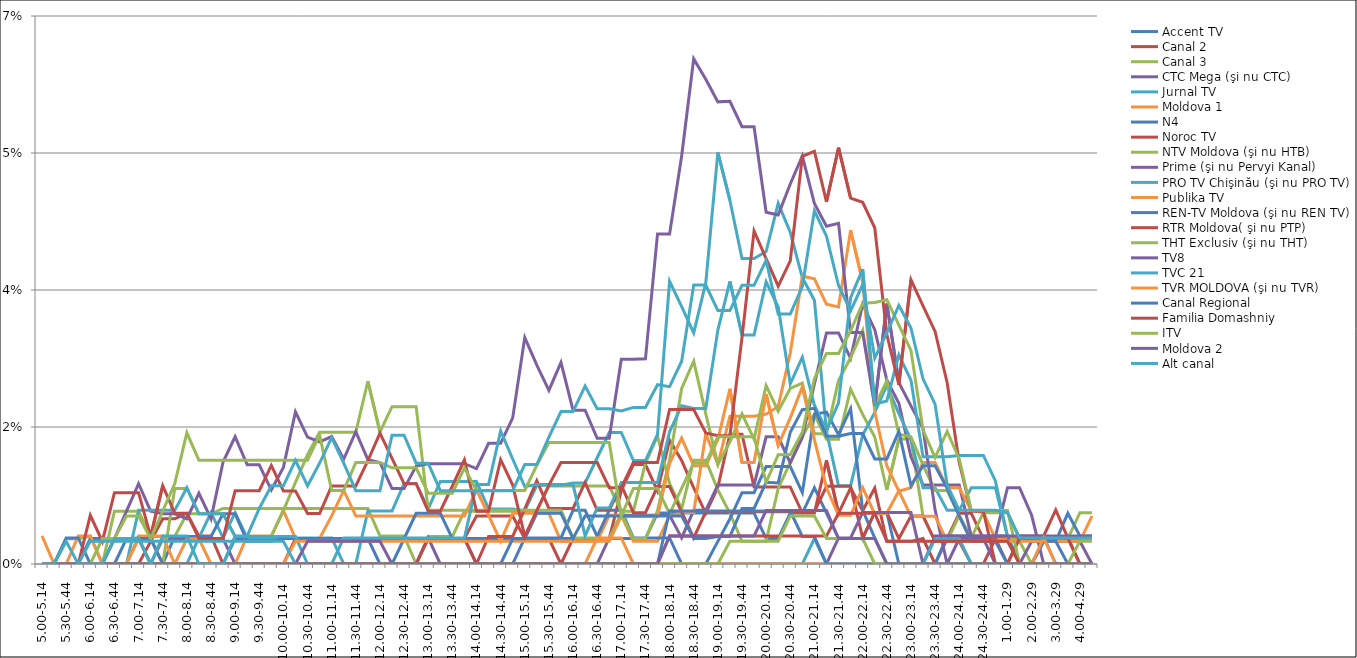
| Category | Accent TV | Canal 2 | Canal 3 | CTC Mega (şi nu CTC) | Jurnal TV | Moldova 1 | N4 | Noroc TV | NTV Moldova (şi nu HTB) | Prime (şi nu Pervyi Kanal) | PRO TV Chişinău (şi nu PRO TV) | Publika TV  | REN-TV Moldova (şi nu REN TV)  | RTR Moldova( şi nu PTP)  | THT Exclusiv (şi nu THT) | TV8 | TVC 21 | TVR MOLDOVA (şi nu TVR) | Canal Regional | Familia Domashniy | ITV | Moldova 2 | Alt canal |
|---|---|---|---|---|---|---|---|---|---|---|---|---|---|---|---|---|---|---|---|---|---|---|---|
| 5.00-5.14 | 0 | 0 | 0 | 0 | 0 | 0 | 0 | 0 | 0 | 0 | 0 | 0.004 | 0 | 0 | 0 | 0 | 0 | 0 | 0 | 0 | 0 | 0 | 0 |
| 5.15-5.29 | 0 | 0 | 0 | 0 | 0 | 0 | 0 | 0 | 0 | 0 | 0 | 0 | 0 | 0 | 0 | 0 | 0 | 0 | 0 | 0 | 0 | 0 | 0 |
| 5.30-5.44 | 0 | 0 | 0.003 | 0 | 0 | 0 | 0 | 0 | 0 | 0 | 0 | 0 | 0.003 | 0 | 0 | 0 | 0 | 0 | 0 | 0 | 0 | 0 | 0.003 |
| 5.45-5.59 | 0 | 0 | 0.003 | 0 | 0 | 0 | 0 | 0 | 0 | 0 | 0 | 0.004 | 0.003 | 0 | 0 | 0 | 0 | 0 | 0 | 0 | 0 | 0 | 0 |
| 6.00-6.14 | 0 | 0 | 0.004 | 0 | 0 | 0 | 0.003 | 0 | 0 | 0 | 0 | 0.004 | 0 | 0.006 | 0 | 0 | 0.003 | 0 | 0 | 0 | 0 | 0 | 0 |
| 6.15-6.29 | 0 | 0 | 0 | 0 | 0 | 0 | 0.003 | 0 | 0 | 0 | 0 | 0 | 0 | 0.003 | 0.003 | 0 | 0.003 | 0 | 0 | 0 | 0 | 0 | 0 |
| 6.30-6.44 | 0 | 0 | 0.007 | 0 | 0 | 0 | 0.003 | 0 | 0.003 | 0.003 | 0 | 0 | 0 | 0.009 | 0.003 | 0 | 0.003 | 0 | 0 | 0 | 0 | 0 | 0.003 |
| 6.45-6.59 | 0 | 0 | 0.007 | 0 | 0 | 0 | 0.003 | 0 | 0.003 | 0.007 | 0 | 0 | 0.003 | 0.009 | 0.006 | 0 | 0.003 | 0 | 0 | 0 | 0 | 0 | 0.003 |
| 7.00-7.14 | 0 | 0 | 0.007 | 0 | 0 | 0.003 | 0.003 | 0 | 0.003 | 0.01 | 0.007 | 0.004 | 0.003 | 0.009 | 0.006 | 0 | 0.003 | 0 | 0 | 0 | 0 | 0 | 0.003 |
| 7.15-7.29 | 0 | 0.003 | 0.004 | 0 | 0 | 0 | 0 | 0 | 0.003 | 0.007 | 0.007 | 0.004 | 0.003 | 0.004 | 0.003 | 0 | 0.003 | 0 | 0 | 0 | 0 | 0 | 0 |
| 7.30-7.44 | 0 | 0.006 | 0.004 | 0.003 | 0 | 0 | 0 | 0 | 0 | 0.006 | 0.007 | 0.004 | 0 | 0.01 | 0.007 | 0 | 0.003 | 0 | 0 | 0 | 0 | 0 | 0.004 |
| 7.45-7.59 | 0 | 0.006 | 0.004 | 0.003 | 0 | 0 | 0.004 | 0 | 0.01 | 0.006 | 0.007 | 0 | 0 | 0.006 | 0.01 | 0 | 0.003 | 0 | 0 | 0 | 0 | 0 | 0.004 |
| 8.00-8.14 | 0 | 0.006 | 0.006 | 0.003 | 0 | 0 | 0.004 | 0 | 0.01 | 0.006 | 0.01 | 0.003 | 0 | 0.006 | 0.017 | 0 | 0.003 | 0 | 0 | 0 | 0 | 0 | 0.004 |
| 8.15-8.29 | 0 | 0.004 | 0.006 | 0.003 | 0.003 | 0 | 0.004 | 0 | 0.006 | 0.009 | 0.006 | 0.003 | 0 | 0.003 | 0.013 | 0 | 0.003 | 0 | 0 | 0 | 0 | 0 | 0 |
| 8.30-8.44 | 0 | 0.004 | 0.006 | 0.003 | 0.007 | 0 | 0.004 | 0 | 0.006 | 0.006 | 0.006 | 0 | 0 | 0.003 | 0.013 | 0 | 0.003 | 0 | 0 | 0 | 0 | 0 | 0 |
| 8.45-8.59 | 0 | 0 | 0.007 | 0.003 | 0.003 | 0 | 0.006 | 0 | 0.006 | 0.013 | 0.006 | 0 | 0 | 0.003 | 0.013 | 0 | 0.003 | 0 | 0 | 0 | 0 | 0 | 0 |
| 9.00-9.14 | 0.003 | 0 | 0.007 | 0 | 0.007 | 0 | 0.006 | 0 | 0.004 | 0.016 | 0.004 | 0 | 0 | 0.009 | 0.013 | 0 | 0.003 | 0 | 0 | 0 | 0 | 0 | 0.004 |
| 9.15-9.29 | 0.003 | 0 | 0.007 | 0 | 0.003 | 0.004 | 0.003 | 0 | 0.004 | 0.013 | 0.004 | 0 | 0 | 0.009 | 0.013 | 0 | 0.003 | 0 | 0 | 0 | 0 | 0 | 0.004 |
| 9.30-9.44 | 0.003 | 0 | 0.007 | 0 | 0.003 | 0.004 | 0.003 | 0 | 0.004 | 0.013 | 0.004 | 0 | 0 | 0.009 | 0.013 | 0 | 0.003 | 0 | 0 | 0 | 0 | 0 | 0.007 |
| 9.45-9.59 | 0.003 | 0 | 0.007 | 0 | 0.003 | 0.004 | 0.003 | 0 | 0.004 | 0.009 | 0.004 | 0 | 0 | 0.013 | 0.013 | 0 | 0.003 | 0 | 0 | 0 | 0 | 0 | 0.01 |
| 10.00-10.14 | 0.003 | 0 | 0.007 | 0 | 0.003 | 0.007 | 0.003 | 0 | 0.007 | 0.012 | 0.004 | 0 | 0 | 0.009 | 0.013 | 0 | 0.003 | 0 | 0 | 0 | 0 | 0 | 0.01 |
| 10.15-10.29 | 0.003 | 0.003 | 0.007 | 0 | 0.003 | 0.003 | 0.003 | 0 | 0.01 | 0.019 | 0.004 | 0.003 | 0 | 0.009 | 0.013 | 0 | 0 | 0 | 0 | 0 | 0 | 0 | 0.013 |
| 10.30-10.44 | 0.003 | 0.003 | 0.007 | 0 | 0.003 | 0.003 | 0.003 | 0 | 0.014 | 0.016 | 0 | 0.003 | 0 | 0.006 | 0.013 | 0.003 | 0 | 0 | 0 | 0 | 0 | 0 | 0.01 |
| 10.45-10.59 | 0.003 | 0.003 | 0.007 | 0 | 0.003 | 0.003 | 0.003 | 0 | 0.017 | 0.016 | 0 | 0.003 | 0 | 0.006 | 0.016 | 0.003 | 0 | 0 | 0 | 0 | 0 | 0 | 0.013 |
| 11.00-11.14 | 0.003 | 0.003 | 0.007 | 0 | 0.003 | 0.006 | 0.003 | 0 | 0.017 | 0.016 | 0 | 0.003 | 0 | 0.01 | 0.009 | 0.003 | 0 | 0 | 0 | 0 | 0 | 0 | 0.016 |
| 11.15-11.29 | 0.003 | 0.003 | 0.007 | 0 | 0 | 0.009 | 0.003 | 0 | 0.017 | 0.013 | 0.003 | 0.003 | 0 | 0.01 | 0.009 | 0.003 | 0 | 0 | 0 | 0 | 0 | 0 | 0.013 |
| 11.30-11.44 | 0.003 | 0.003 | 0.007 | 0 | 0 | 0.006 | 0.003 | 0 | 0.017 | 0.017 | 0.003 | 0.003 | 0 | 0.01 | 0.013 | 0.003 | 0 | 0 | 0 | 0 | 0 | 0 | 0.009 |
| 11.45-11.59 | 0.003 | 0.003 | 0.007 | 0 | 0.007 | 0.006 | 0.003 | 0 | 0.023 | 0.013 | 0.003 | 0.003 | 0 | 0.013 | 0.013 | 0.003 | 0 | 0 | 0 | 0 | 0 | 0 | 0.009 |
| 12.00-12.14 | 0.003 | 0.003 | 0.004 | 0 | 0.007 | 0.006 | 0 | 0 | 0.017 | 0.013 | 0.003 | 0.003 | 0 | 0.017 | 0.013 | 0.003 | 0 | 0 | 0 | 0 | 0 | 0 | 0.009 |
| 12.15-12.29 | 0.003 | 0.003 | 0.004 | 0 | 0.007 | 0.006 | 0 | 0 | 0.02 | 0.01 | 0.003 | 0.003 | 0 | 0.013 | 0.012 | 0 | 0 | 0 | 0 | 0 | 0 | 0 | 0.016 |
| 12.30-12.44 | 0.003 | 0.003 | 0.004 | 0 | 0.01 | 0.006 | 0.003 | 0 | 0.02 | 0.01 | 0.003 | 0.003 | 0 | 0.01 | 0.012 | 0 | 0 | 0 | 0 | 0 | 0 | 0 | 0.016 |
| 12.45-12.59 | 0.003 | 0.003 | 0 | 0 | 0.01 | 0.006 | 0.006 | 0 | 0.02 | 0.013 | 0.003 | 0.003 | 0 | 0.01 | 0.012 | 0 | 0 | 0 | 0 | 0 | 0 | 0 | 0.013 |
| 13.00-13.14 | 0.003 | 0.003 | 0.004 | 0.003 | 0.007 | 0.006 | 0.006 | 0.003 | 0.007 | 0.013 | 0.003 | 0.003 | 0 | 0.007 | 0.009 | 0 | 0 | 0 | 0 | 0 | 0 | 0 | 0.013 |
| 13.15-13.29 | 0.003 | 0.003 | 0.004 | 0 | 0.011 | 0.006 | 0.006 | 0.003 | 0.007 | 0.013 | 0.003 | 0.003 | 0 | 0.007 | 0.009 | 0 | 0 | 0 | 0 | 0 | 0 | 0 | 0.009 |
| 13.30-13.44 | 0.003 | 0.003 | 0.004 | 0 | 0.011 | 0.006 | 0.003 | 0.003 | 0.007 | 0.013 | 0.003 | 0.003 | 0 | 0.01 | 0.009 | 0 | 0 | 0 | 0 | 0 | 0 | 0 | 0.009 |
| 13.45-13.59 | 0.003 | 0.003 | 0.007 | 0 | 0.011 | 0.006 | 0.003 | 0.003 | 0.007 | 0.013 | 0.003 | 0.003 | 0 | 0.013 | 0.012 | 0 | 0 | 0 | 0 | 0 | 0 | 0 | 0.009 |
| 14.00-14.14 | 0.003 | 0.006 | 0.007 | 0 | 0.011 | 0.009 | 0 | 0 | 0.007 | 0.012 | 0.01 | 0.003 | 0 | 0.007 | 0.009 | 0 | 0 | 0 | 0 | 0 | 0 | 0 | 0.009 |
| 14.15-14.29 | 0.003 | 0.006 | 0.007 | 0 | 0.007 | 0.006 | 0 | 0.004 | 0.007 | 0.015 | 0.01 | 0.003 | 0 | 0.007 | 0.009 | 0 | 0 | 0 | 0 | 0 | 0 | 0 | 0.009 |
| 14.30-14.44 | 0.003 | 0.006 | 0.007 | 0 | 0.007 | 0.003 | 0 | 0.004 | 0.007 | 0.015 | 0.017 | 0.003 | 0 | 0.013 | 0.009 | 0 | 0 | 0 | 0 | 0 | 0 | 0 | 0.009 |
| 14.45-14.59 | 0.003 | 0.006 | 0.007 | 0 | 0.007 | 0.006 | 0 | 0.004 | 0.007 | 0.019 | 0.013 | 0.003 | 0.003 | 0.01 | 0.009 | 0 | 0 | 0 | 0 | 0 | 0 | 0 | 0.009 |
| 15.00-15.14 | 0.003 | 0.003 | 0.007 | 0 | 0.007 | 0.006 | 0.003 | 0.007 | 0.007 | 0.029 | 0.01 | 0.003 | 0.003 | 0.004 | 0.009 | 0 | 0 | 0 | 0 | 0 | 0 | 0 | 0.013 |
| 15.15-15.29 | 0.003 | 0.003 | 0.007 | 0 | 0.01 | 0.006 | 0.003 | 0.011 | 0.007 | 0.025 | 0.01 | 0.003 | 0.006 | 0.007 | 0.013 | 0 | 0 | 0 | 0 | 0 | 0 | 0 | 0.013 |
| 15.30-15.44 | 0.003 | 0.003 | 0.01 | 0 | 0.01 | 0.006 | 0.003 | 0.007 | 0.007 | 0.022 | 0.01 | 0.003 | 0.006 | 0.01 | 0.016 | 0 | 0 | 0 | 0 | 0 | 0 | 0 | 0.016 |
| 15.45-15.59 | 0.003 | 0 | 0.01 | 0 | 0.01 | 0.003 | 0.003 | 0.007 | 0.007 | 0.026 | 0.01 | 0.003 | 0.006 | 0.013 | 0.016 | 0 | 0 | 0 | 0 | 0 | 0 | 0 | 0.019 |
| 16.00-16.14 | 0.003 | 0.003 | 0.01 | 0 | 0.01 | 0.003 | 0.007 | 0.007 | 0.003 | 0.02 | 0.01 | 0.003 | 0.003 | 0.013 | 0.016 | 0 | 0 | 0 | 0 | 0 | 0 | 0 | 0.019 |
| 16.15-16.29 | 0.003 | 0.003 | 0.01 | 0 | 0.01 | 0.003 | 0.007 | 0.01 | 0.003 | 0.02 | 0.004 | 0.003 | 0.006 | 0.013 | 0.016 | 0 | 0 | 0 | 0 | 0 | 0 | 0 | 0.023 |
| 16.30-16.44 | 0.003 | 0.003 | 0.01 | 0 | 0.014 | 0.003 | 0.004 | 0.007 | 0.003 | 0.016 | 0.007 | 0.003 | 0.006 | 0.013 | 0.016 | 0 | 0 | 0.003 | 0 | 0 | 0 | 0 | 0.02 |
| 16.45-16.59 | 0.003 | 0.003 | 0.01 | 0.003 | 0.017 | 0.006 | 0.007 | 0.007 | 0.003 | 0.016 | 0.007 | 0.003 | 0.006 | 0.01 | 0.016 | 0 | 0 | 0.003 | 0 | 0 | 0 | 0 | 0.02 |
| 17.00-17.14 | 0.003 | 0.009 | 0.007 | 0.006 | 0.017 | 0.006 | 0.007 | 0.01 | 0.006 | 0.026 | 0.01 | 0.006 | 0.006 | 0.01 | 0.006 | 0 | 0 | 0.003 | 0 | 0 | 0 | 0 | 0.02 |
| 17.15-17.29 | 0.003 | 0.013 | 0.007 | 0.006 | 0.013 | 0.003 | 0.003 | 0.007 | 0.003 | 0.026 | 0.01 | 0.006 | 0.006 | 0.013 | 0.01 | 0 | 0 | 0 | 0 | 0 | 0 | 0 | 0.02 |
| 17.30-17.44 | 0.003 | 0.013 | 0.013 | 0.006 | 0.013 | 0.003 | 0.003 | 0.007 | 0.003 | 0.026 | 0.01 | 0.006 | 0.006 | 0.013 | 0.01 | 0 | 0 | 0 | 0 | 0 | 0 | 0 | 0.02 |
| 17.45-17.59 | 0.007 | 0.009 | 0.016 | 0.006 | 0.017 | 0.003 | 0.003 | 0.01 | 0.007 | 0.042 | 0.01 | 0.006 | 0.006 | 0.013 | 0.01 | 0 | 0 | 0 | 0 | 0 | 0 | 0 | 0.023 |
| 18.00-18.14 | 0.007 | 0.016 | 0.01 | 0.006 | 0.036 | 0.006 | 0.003 | 0.01 | 0.013 | 0.042 | 0.017 | 0.013 | 0.006 | 0.02 | 0.006 | 0 | 0 | 0 | 0.007 | 0.004 | 0 | 0.004 | 0.023 |
| 18.15-18.29 | 0.007 | 0.013 | 0.007 | 0.003 | 0.033 | 0.007 | 0 | 0.007 | 0.022 | 0.052 | 0.02 | 0.016 | 0.006 | 0.02 | 0.01 | 0 | 0 | 0 | 0.007 | 0.004 | 0 | 0.004 | 0.026 |
| 18.30-18.44 | 0.007 | 0.01 | 0.013 | 0.007 | 0.03 | 0.007 | 0 | 0.003 | 0.026 | 0.065 | 0.02 | 0.013 | 0.003 | 0.02 | 0.013 | 0 | 0 | 0 | 0.007 | 0.004 | 0 | 0.004 | 0.036 |
| 18.45-18.59 | 0.007 | 0.006 | 0.013 | 0.007 | 0.036 | 0.017 | 0 | 0.007 | 0.019 | 0.062 | 0.02 | 0.013 | 0.003 | 0.017 | 0.013 | 0 | 0 | 0 | 0.007 | 0.004 | 0 | 0.004 | 0.036 |
| 19.00-19.14 | 0.007 | 0.01 | 0.009 | 0.01 | 0.053 | 0.013 | 0.003 | 0.007 | 0.013 | 0.059 | 0.03 | 0.016 | 0.004 | 0.016 | 0.016 | 0 | 0 | 0 | 0.007 | 0.004 | 0 | 0.004 | 0.032 |
| 19.15-19.29 | 0.007 | 0.017 | 0.006 | 0.01 | 0.046 | 0.019 | 0.006 | 0.007 | 0.016 | 0.059 | 0.036 | 0.022 | 0.004 | 0.016 | 0.016 | 0 | 0 | 0 | 0.007 | 0.004 | 0.003 | 0.004 | 0.032 |
| 19.30-19.44 | 0.007 | 0.017 | 0.003 | 0.01 | 0.039 | 0.019 | 0.009 | 0.007 | 0.019 | 0.056 | 0.029 | 0.013 | 0.007 | 0.029 | 0.016 | 0 | 0 | 0 | 0.007 | 0.004 | 0.003 | 0.004 | 0.036 |
| 19.45-19.59 | 0.007 | 0.01 | 0.003 | 0.01 | 0.039 | 0.019 | 0.009 | 0.007 | 0.016 | 0.056 | 0.029 | 0.013 | 0.007 | 0.043 | 0.016 | 0 | 0 | 0 | 0.007 | 0.004 | 0.003 | 0.004 | 0.036 |
| 20.00-20.14 | 0.003 | 0.01 | 0.003 | 0.016 | 0.04 | 0.019 | 0.012 | 0.007 | 0.023 | 0.045 | 0.036 | 0.022 | 0.01 | 0.039 | 0.01 | 0 | 0 | 0 | 0.007 | 0.004 | 0.003 | 0.007 | 0.039 |
| 20.15-20.29 | 0.003 | 0.01 | 0.01 | 0.016 | 0.046 | 0.02 | 0.012 | 0.007 | 0.02 | 0.045 | 0.033 | 0.015 | 0.01 | 0.035 | 0.014 | 0 | 0 | 0 | 0.007 | 0.004 | 0.003 | 0.007 | 0.032 |
| 20.30-20.44 | 0.007 | 0.01 | 0.013 | 0.013 | 0.042 | 0.027 | 0.012 | 0.007 | 0.022 | 0.049 | 0.023 | 0.019 | 0.017 | 0.039 | 0.014 | 0 | 0 | 0 | 0.007 | 0.004 | 0.006 | 0.007 | 0.032 |
| 20.45-20.59 | 0.007 | 0.007 | 0.016 | 0.016 | 0.037 | 0.037 | 0.009 | 0.007 | 0.023 | 0.052 | 0.026 | 0.023 | 0.02 | 0.052 | 0.017 | 0 | 0 | 0 | 0.004 | 0.004 | 0.006 | 0.007 | 0.035 |
| 21.00-21.14 | 0.01 | 0.007 | 0.019 | 0.023 | 0.034 | 0.036 | 0.019 | 0.007 | 0.017 | 0.046 | 0.02 | 0.016 | 0.02 | 0.053 | 0.024 | 0 | 0.003 | 0 | 0.004 | 0.004 | 0.006 | 0.007 | 0.045 |
| 21.15-21.29 | 0.007 | 0.013 | 0.016 | 0.03 | 0.017 | 0.033 | 0.019 | 0.01 | 0.017 | 0.043 | 0.017 | 0.01 | 0.016 | 0.046 | 0.027 | 0 | 0 | 0 | 0 | 0.004 | 0.003 | 0.007 | 0.042 |
| 21.30-21.44 | 0.003 | 0.006 | 0.016 | 0.03 | 0.01 | 0.033 | 0.017 | 0.01 | 0.023 | 0.044 | 0.021 | 0.006 | 0.016 | 0.053 | 0.027 | 0.003 | 0 | 0 | 0 | 0.006 | 0.003 | 0.003 | 0.036 |
| 21.45-21.59 | 0.003 | 0.01 | 0.022 | 0.026 | 0.01 | 0.043 | 0.02 | 0.01 | 0.026 | 0.03 | 0.034 | 0.006 | 0.017 | 0.047 | 0.03 | 0.003 | 0 | 0 | 0 | 0.006 | 0.003 | 0.003 | 0.032 |
| 22.00-22.14 | 0.003 | 0.007 | 0.019 | 0.033 | 0.016 | 0.036 | 0.007 | 0.003 | 0.03 | 0.03 | 0.038 | 0.01 | 0.017 | 0.046 | 0.033 | 0.007 | 0 | 0 | 0 | 0.006 | 0.003 | 0.003 | 0.036 |
| 22.15-22.29 | 0.007 | 0.01 | 0.016 | 0.03 | 0.019 | 0.019 | 0.003 | 0.007 | 0.02 | 0.02 | 0.02 | 0.006 | 0.013 | 0.043 | 0.033 | 0.007 | 0 | 0 | 0 | 0.006 | 0 | 0.003 | 0.026 |
| 22.30-22.44 | 0.007 | 0.003 | 0.009 | 0.024 | 0.023 | 0.013 | 0 | 0.007 | 0.023 | 0.033 | 0.021 | 0.006 | 0.013 | 0.029 | 0.034 | 0.007 | 0 | 0 | 0 | 0.003 | 0 | 0 | 0.03 |
| 22.45-22.59 | 0 | 0.003 | 0.016 | 0.021 | 0.019 | 0.009 | 0 | 0.003 | 0.017 | 0.023 | 0.027 | 0.009 | 0.017 | 0.023 | 0.031 | 0.007 | 0 | 0 | 0 | 0.003 | 0 | 0 | 0.033 |
| 23.00-23.14 | 0 | 0.003 | 0.016 | 0.014 | 0.016 | 0.01 | 0 | 0.006 | 0.016 | 0.02 | 0.023 | 0.006 | 0.01 | 0.036 | 0.027 | 0.007 | 0 | 0 | 0 | 0.003 | 0 | 0 | 0.03 |
| 23.15-23.29 | 0 | 0.003 | 0.006 | 0.01 | 0.01 | 0.013 | 0 | 0.006 | 0.013 | 0.017 | 0.014 | 0.006 | 0.013 | 0.033 | 0.017 | 0 | 0 | 0 | 0 | 0.003 | 0 | 0 | 0.024 |
| 23.30-23.44 | 0 | 0 | 0.003 | 0.01 | 0.01 | 0.013 | 0 | 0.003 | 0.009 | 0.007 | 0.014 | 0.006 | 0.013 | 0.03 | 0.014 | 0.004 | 0.003 | 0 | 0 | 0.003 | 0 | 0 | 0.02 |
| 23.45-23.59 | 0 | 0.003 | 0.003 | 0.01 | 0.007 | 0.01 | 0.004 | 0.003 | 0.009 | 0 | 0.014 | 0.003 | 0.01 | 0.023 | 0.017 | 0.004 | 0.003 | 0 | 0 | 0.003 | 0 | 0 | 0.01 |
| 24.00-24.14 | 0 | 0.006 | 0.006 | 0.01 | 0.007 | 0.01 | 0.004 | 0.003 | 0.006 | 0.003 | 0.014 | 0.003 | 0.006 | 0.013 | 0.013 | 0.004 | 0.003 | 0 | 0 | 0.003 | 0 | 0 | 0.007 |
| 24.15-24.29 | 0 | 0.006 | 0.003 | 0.004 | 0.01 | 0.007 | 0.004 | 0 | 0.003 | 0.003 | 0.014 | 0.003 | 0.003 | 0.007 | 0.007 | 0.004 | 0 | 0 | 0 | 0.003 | 0 | 0 | 0.007 |
| 24.30-24.44 | 0 | 0.003 | 0.007 | 0.004 | 0.01 | 0.007 | 0.004 | 0 | 0.003 | 0.003 | 0.014 | 0.003 | 0.003 | 0.007 | 0.007 | 0.004 | 0 | 0 | 0 | 0.003 | 0 | 0 | 0.007 |
| 24.45-24.59 | 0 | 0.003 | 0.007 | 0.004 | 0.01 | 0.003 | 0.004 | 0.003 | 0.003 | 0 | 0.011 | 0.003 | 0.003 | 0 | 0.007 | 0.004 | 0 | 0 | 0 | 0.003 | 0 | 0 | 0.007 |
| 1.00-1.29 | 0 | 0.003 | 0.007 | 0.01 | 0.004 | 0.003 | 0.004 | 0 | 0.003 | 0 | 0.004 | 0.003 | 0 | 0 | 0.007 | 0.004 | 0 | 0 | 0 | 0.003 | 0 | 0 | 0.007 |
| 1.30-1. 59 | 0 | 0 | 0.003 | 0.01 | 0.004 | 0.003 | 0 | 0.004 | 0.003 | 0 | 0.004 | 0.003 | 0 | 0.003 | 0 | 0.004 | 0 | 0 | 0 | 0 | 0 | 0 | 0.003 |
| 2.00-2.29 | 0 | 0 | 0.003 | 0.006 | 0.004 | 0.003 | 0 | 0.004 | 0 | 0.003 | 0.004 | 0.003 | 0 | 0.003 | 0 | 0.004 | 0 | 0 | 0 | 0 | 0 | 0 | 0.003 |
| 2.30-2.59 | 0 | 0 | 0.003 | 0 | 0.004 | 0.003 | 0.003 | 0.004 | 0 | 0.003 | 0.004 | 0.003 | 0.003 | 0.003 | 0 | 0.004 | 0 | 0.003 | 0 | 0 | 0 | 0 | 0.003 |
| 3.00-3.29 | 0 | 0 | 0.003 | 0 | 0 | 0.003 | 0.003 | 0.007 | 0 | 0.003 | 0.004 | 0.003 | 0.003 | 0.003 | 0 | 0.004 | 0 | 0 | 0 | 0 | 0 | 0 | 0.003 |
| 3.30-3.59 | 0 | 0 | 0.003 | 0 | 0 | 0.003 | 0.006 | 0.003 | 0 | 0.003 | 0.004 | 0.003 | 0 | 0.003 | 0 | 0.004 | 0 | 0 | 0 | 0 | 0 | 0 | 0.003 |
| 4.00-4.29 | 0 | 0 | 0.007 | 0 | 0 | 0.003 | 0.004 | 0 | 0 | 0.003 | 0.004 | 0.003 | 0 | 0 | 0.003 | 0.004 | 0 | 0 | 0 | 0 | 0 | 0 | 0.003 |
| 4.30-4.59 | 0 | 0 | 0.007 | 0 | 0 | 0.003 | 0.004 | 0 | 0 | 0 | 0.004 | 0.006 | 0 | 0 | 0.003 | 0.004 | 0 | 0 | 0 | 0 | 0 | 0 | 0.003 |